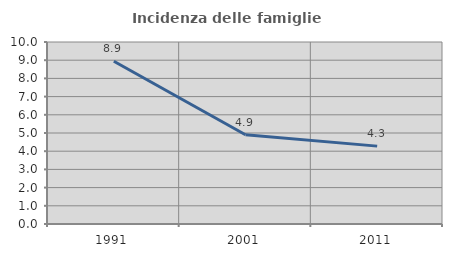
| Category | Incidenza delle famiglie numerose |
|---|---|
| 1991.0 | 8.941 |
| 2001.0 | 4.906 |
| 2011.0 | 4.279 |